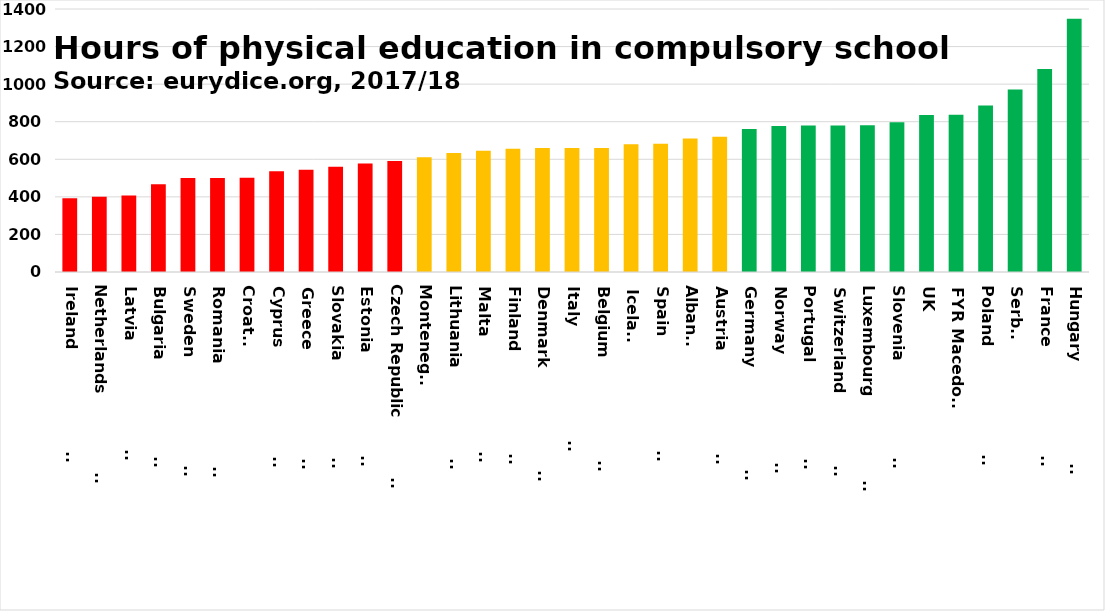
| Category | Series 0 |
|---|---|
| Ireland                       | 392 |
| Netherlands                   | 400 |
| Latvia                        | 407 |
| Bulgaria                      | 467 |
| Sweden                        | 500 |
| Romania                       | 501 |
| Croatia | 502 |
| Cyprus                        | 536 |
| Greece                        | 544 |
| Slovakia                      | 560 |
| Estonia                       | 578 |
| Czech Republic                | 591 |
| Montenegro | 611 |
| Lithuania                     | 633 |
| Malta                         | 646 |
| Finland                       | 656 |
| Denmark                       | 660 |
| Italy                         | 660 |
| Belgium                       | 660 |
| Iceland | 680 |
| Spain                         | 683 |
| Albania | 711 |
| Austria                       | 720 |
| Germany                       | 761 |
| Norway                        | 777 |
| Portugal                      | 780 |
| Switzerland                   | 780 |
| Luxembourg                    | 781 |
| Slovenia                      | 797 |
| UK | 836 |
| FYR Macedonia | 837 |
| Poland                        | 886 |
| Serbia | 972 |
| France                        | 1080 |
| Hungary                       | 1348 |